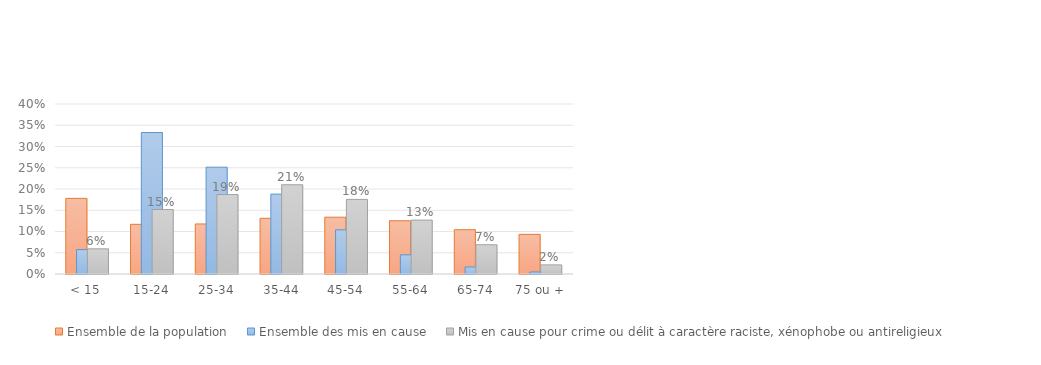
| Category | Ensemble de la population | Ensemble des mis en cause | Mis en cause pour crime ou délit à caractère raciste, xénophobe ou antireligieux |
|---|---|---|---|
| < 15 | 0.178 | 0.057 | 0.059 |
| 15-24 | 0.117 | 0.333 | 0.152 |
| 25-34 | 0.118 | 0.251 | 0.187 |
| 35-44 | 0.131 | 0.188 | 0.21 |
| 45-54 | 0.134 | 0.104 | 0.176 |
| 55-64 | 0.125 | 0.045 | 0.127 |
| 65-74 | 0.104 | 0.017 | 0.069 |
| 75 ou + | 0.093 | 0.005 | 0.021 |